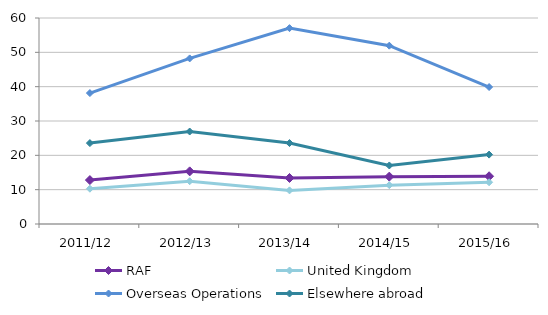
| Category | RAF | United Kingdom | Overseas Operations | Elsewhere abroad |
|---|---|---|---|---|
| 2011/12 | 12.789 | 10.281 | 38.135 | 23.564 |
| 2012/13 | 15.329 | 12.461 | 48.229 | 26.935 |
| 2013/14 | 13.401 | 9.792 | 57.049 | 23.577 |
| 2014/15 | 13.796 | 11.318 | 51.937 | 17.052 |
| 2015/16 | 13.903 | 12.158 | 39.89 | 20.213 |